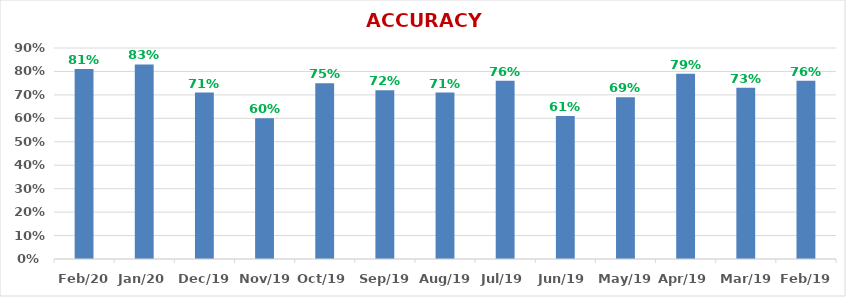
| Category | ACCURACY |
|---|---|
| 2020-02-01 | 0.81 |
| 2020-01-01 | 0.83 |
| 2019-12-01 | 0.71 |
| 2019-11-01 | 0.6 |
| 2019-10-01 | 0.75 |
| 2019-09-01 | 0.72 |
| 2019-08-01 | 0.71 |
| 2019-07-01 | 0.76 |
| 2019-06-01 | 0.61 |
| 2019-05-01 | 0.69 |
| 2019-04-01 | 0.79 |
| 2019-03-01 | 0.73 |
| 2019-02-01 | 0.76 |